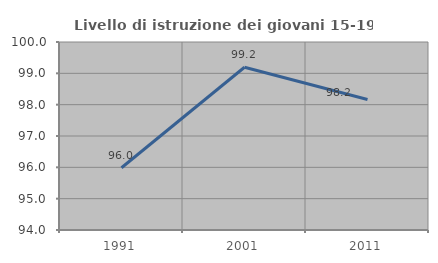
| Category | Livello di istruzione dei giovani 15-19 anni |
|---|---|
| 1991.0 | 95.988 |
| 2001.0 | 99.194 |
| 2011.0 | 98.165 |